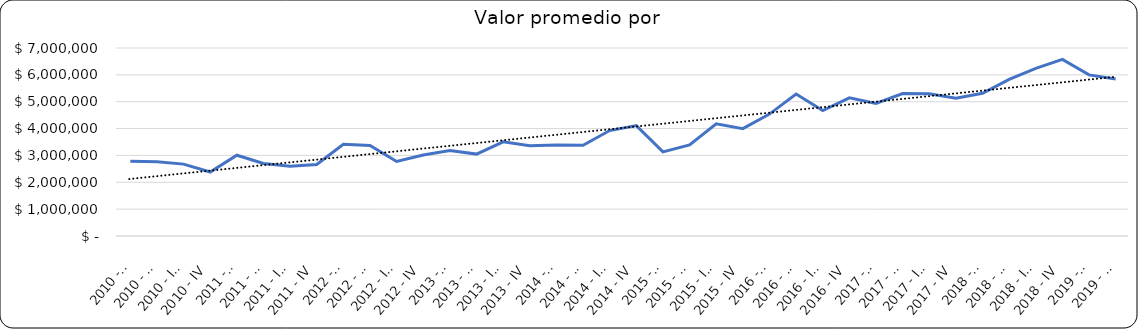
| Category | Valor m2 en Bogotá por sectores |
|---|---|
| 2010 - I | 2784313.725 |
| 2010 - II | 2767549.02 |
| 2010 - III | 2676470.588 |
| 2010 - IV | 2382352.941 |
| 2011 - I | 3006329.114 |
| 2011 - II | 2700421.941 |
| 2011 - III | 2594936.709 |
| 2011 - IV | 2661339.662 |
| 2012 - I | 3412698.413 |
| 2012 - II | 3373015.873 |
| 2012 - III | 2773809.524 |
| 2012 - IV | 3015873.016 |
| 2013 - I | 3181818.182 |
| 2013 - II | 3049783.55 |
| 2013 - III | 3506493.506 |
| 2013 - IV | 3361471.861 |
| 2014 - I | 3388888.889 |
| 2014 - II | 3375925.926 |
| 2014 - III | 3925925.926 |
| 2014 - IV | 4111111.111 |
| 2015 - I | 3133333.333 |
| 2015 - II | 3393333.333 |
| 2015 - III | 4175000 |
| 2015 - IV | 3996666.667 |
| 2016 - I | 4539007.092 |
| 2016 - II | 5283962.264 |
| 2016 - III | 4670634.921 |
| 2016 - IV | 5146296.296 |
| 2017 - I | 4938271.605 |
| 2017 - II | 5303867.403 |
| 2017 - III | 5292307.692 |
| 2017 - IV | 5129144.852 |
| 2018 - I | 5316455.696 |
| 2018 - II | 5833333.333 |
| 2018 - III | 6243032 |
| 2018 - IV | 6575342 |
| 2019 - I | 5999390 |
| 2019 - II | 5842640 |